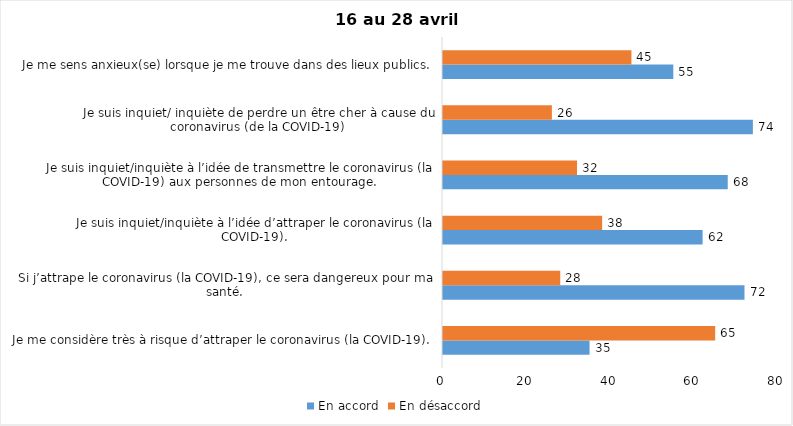
| Category | En accord | En désaccord |
|---|---|---|
| Je me considère très à risque d’attraper le coronavirus (la COVID-19). | 35 | 65 |
| Si j’attrape le coronavirus (la COVID-19), ce sera dangereux pour ma santé. | 72 | 28 |
| Je suis inquiet/inquiète à l’idée d’attraper le coronavirus (la COVID-19). | 62 | 38 |
| Je suis inquiet/inquiète à l’idée de transmettre le coronavirus (la COVID-19) aux personnes de mon entourage. | 68 | 32 |
| Je suis inquiet/ inquiète de perdre un être cher à cause du coronavirus (de la COVID-19) | 74 | 26 |
| Je me sens anxieux(se) lorsque je me trouve dans des lieux publics. | 55 | 45 |